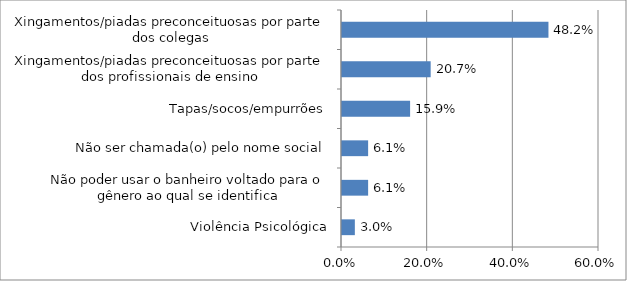
| Category | Series 0 |
|---|---|
| Violência Psicológica | 0.03 |
| Não poder usar o banheiro voltado para o gênero ao qual se identifica | 0.061 |
| Não ser chamada(o) pelo nome social | 0.061 |
| Tapas/socos/empurrões | 0.159 |
| Xingamentos/piadas preconceituosas por parte dos profissionais de ensino | 0.207 |
| Xingamentos/piadas preconceituosas por parte dos colegas | 0.482 |